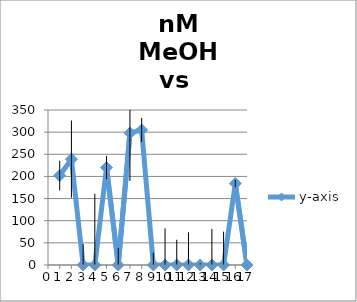
| Category | y-axis |
|---|---|
| 1.0 | 202 |
| 2.0 | 239 |
| 3.0 | 0 |
| 4.0 | 0 |
| 5.0 | 220 |
| 6.0 | 0 |
| 7.0 | 298 |
| 8.0 | 305 |
| 9.0 | 0 |
| 10.0 | 0 |
| 11.0 | 0 |
| 12.0 | 0 |
| 13.0 | 0 |
| 14.0 | 0 |
| 15.0 | 0 |
| 16.0 | 184 |
| 17.0 | 0 |